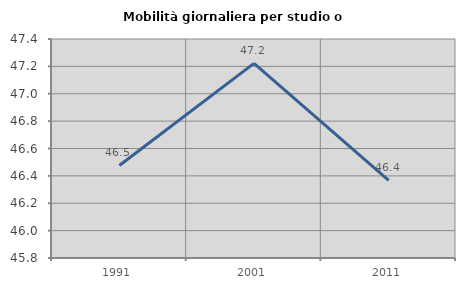
| Category | Mobilità giornaliera per studio o lavoro |
|---|---|
| 1991.0 | 46.476 |
| 2001.0 | 47.222 |
| 2011.0 | 46.367 |